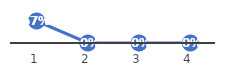
| Category | Series 0 |
|---|---|
| 0 | 0.667 |
| 1 | 0 |
| 2 | 0 |
| 3 | 0 |